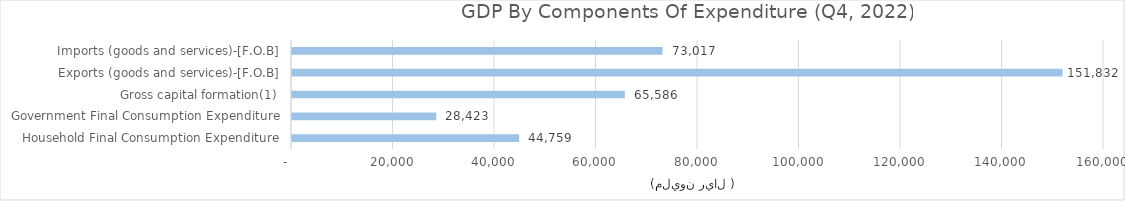
| Category |  GDP By Components Of Expenditure |
|---|---|
| Household Final Consumption Expenditure | 44758.652 |
| Government Final Consumption Expenditure | 28423.059 |
| Gross capital formation(1) | 65586.484 |
| Exports (goods and services)-[F.O.B] | 151832 |
| Imports (goods and services)-[F.O.B] | 73017 |